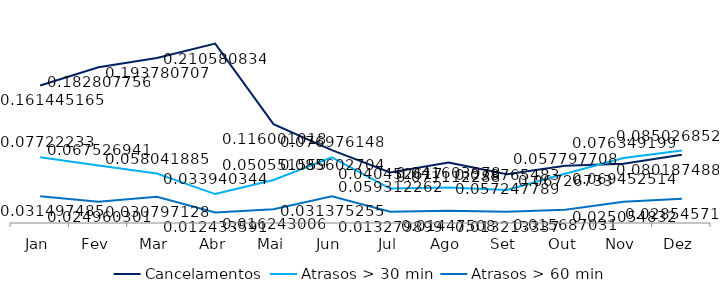
| Category | Cancelamentos | Atrasos > 30 min | Atrasos > 60 min |
|---|---|---|---|
| Jan | 0.161 | 0.077 | 0.031 |
| Fev | 0.183 | 0.068 | 0.025 |
| Mar | 0.194 | 0.058 | 0.031 |
| Abr | 0.211 | 0.034 | 0.012 |
| Mai | 0.116 | 0.051 | 0.016 |
| Jun | 0.086 | 0.077 | 0.031 |
| Jul | 0.059 | 0.04 | 0.013 |
| Ago | 0.071 | 0.042 | 0.014 |
| Set | 0.057 | 0.039 | 0.013 |
| Out | 0.067 | 0.058 | 0.016 |
| Nov | 0.069 | 0.076 | 0.025 |
| Dez | 0.08 | 0.085 | 0.029 |